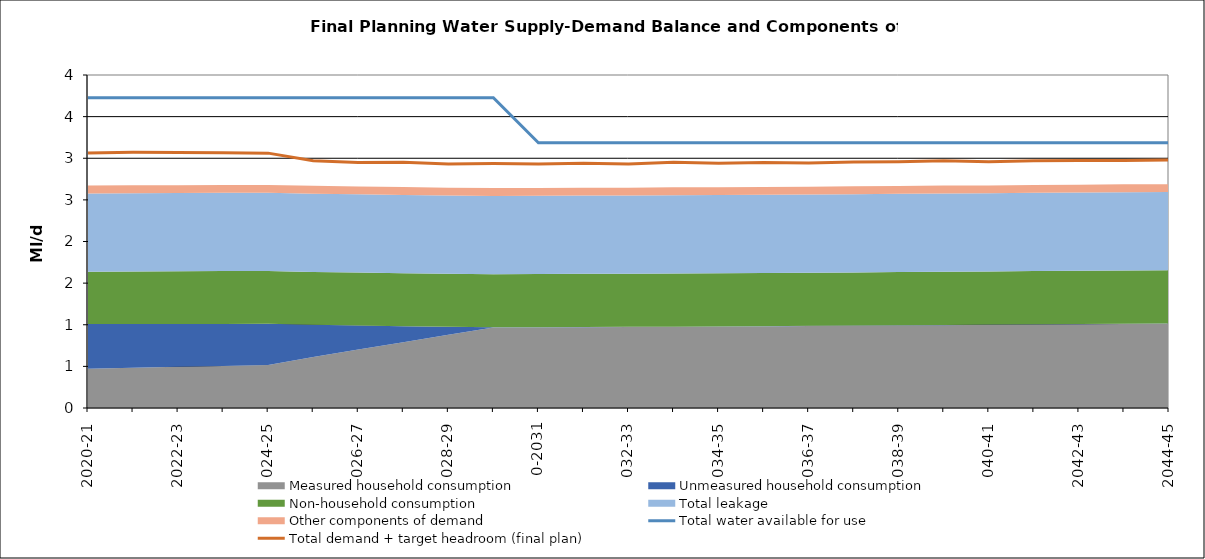
| Category | Total water available for use | Total demand + target headroom (final plan) |
|---|---|---|
| 0 | 3.726 | 3.064 |
| 1 | 3.726 | 3.072 |
| 2 | 3.726 | 3.069 |
| 3 | 3.726 | 3.066 |
| 4 | 3.726 | 3.061 |
| 5 | 3.726 | 2.969 |
| 6 | 3.726 | 2.95 |
| 7 | 3.726 | 2.952 |
| 8 | 3.726 | 2.932 |
| 9 | 3.726 | 2.937 |
| 10 | 3.186 | 2.93 |
| 11 | 3.186 | 2.94 |
| 12 | 3.186 | 2.931 |
| 13 | 3.186 | 2.951 |
| 14 | 3.186 | 2.94 |
| 15 | 3.186 | 2.948 |
| 16 | 3.186 | 2.944 |
| 17 | 3.186 | 2.953 |
| 18 | 3.186 | 2.959 |
| 19 | 3.186 | 2.969 |
| 20 | 3.186 | 2.959 |
| 21 | 3.186 | 2.97 |
| 22 | 3.186 | 2.974 |
| 23 | 3.186 | 2.972 |
| 24 | 3.186 | 2.978 |